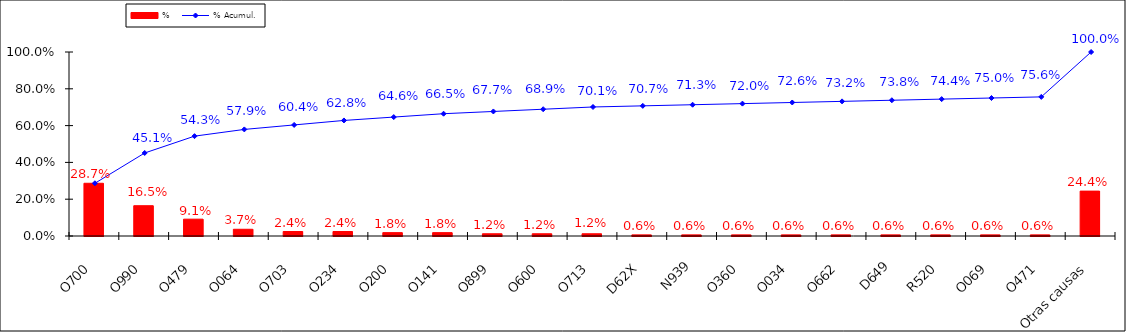
| Category | % |
|---|---|
| O700 | 0.287 |
| O990 | 0.165 |
| O479 | 0.091 |
| O064 | 0.037 |
| O703 | 0.024 |
| O234 | 0.024 |
| O200 | 0.018 |
| O141 | 0.018 |
| O899 | 0.012 |
| O600 | 0.012 |
| O713 | 0.012 |
| D62X | 0.006 |
| N939 | 0.006 |
| O360 | 0.006 |
| O034 | 0.006 |
| O662 | 0.006 |
| D649 | 0.006 |
| R520 | 0.006 |
| O069 | 0.006 |
| O471 | 0.006 |
| Otras causas | 0.244 |